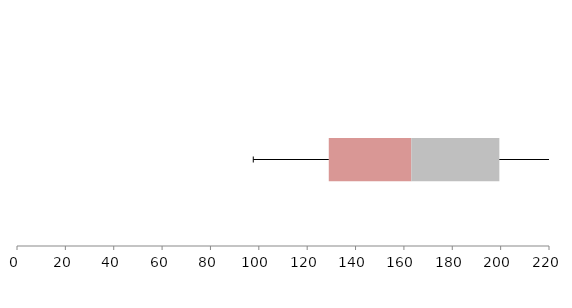
| Category | Series 1 | Series 2 | Series 3 |
|---|---|---|---|
| 0 | 128.93 | 34.138 | 36.399 |